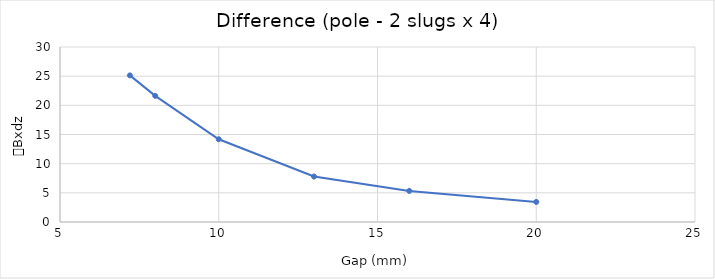
| Category | Difference |
|---|---|
| 7.2 | 25.135 |
| 8.0 | 21.62 |
| 10.0 | 14.185 |
| 13.0 | 7.795 |
| 16.0 | 5.328 |
| 20.0 | 3.438 |